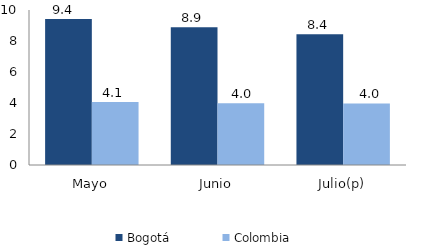
| Category | Bogotá | Colombia |
|---|---|---|
| Mayo | 9.413 | 4.072 |
| Junio | 8.888 | 3.98 |
| Julio(p) | 8.436 | 3.976 |